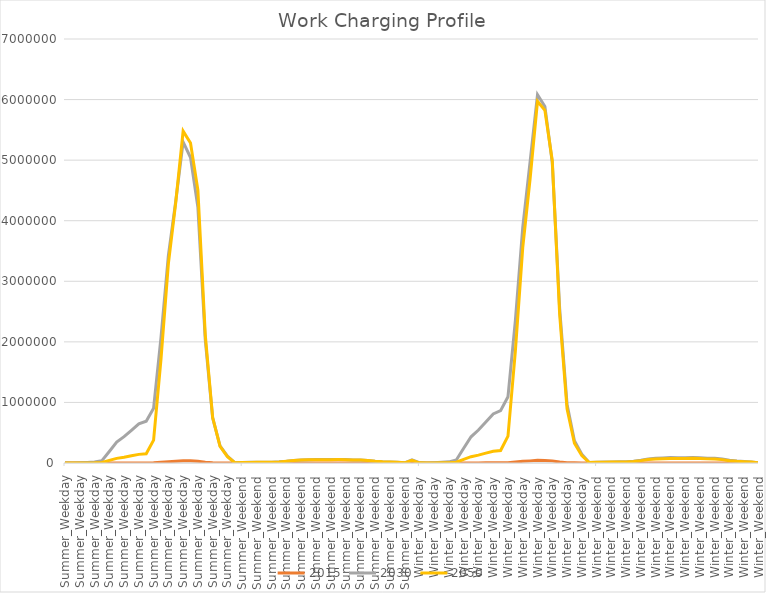
| Category | 2015 | 2030 | 2050 |
|---|---|---|---|
| Summer_Weekday | 2.753 | 3502.4 | 1314.9 |
| Summer_Weekday | 2.74 | 1036.7 | 227.6 |
| Summer_Weekday | 13.685 | 3770.1 | 849.36 |
| Summer_Weekday | 27.383 | 8600.3 | 1915.2 |
| Summer_Weekday | 46.558 | 15150 | 3364.1 |
| Summer_Weekday | 134.15 | 39491 | 8843.3 |
| Summer_Weekday | 695.21 | 190880 | 43017 |
| Summer_Weekday | 1018.9 | 343960 | 76152 |
| Summer_Weekday | 1213.7 | 434170 | 95704 |
| Summer_Weekday | 1536.9 | 539900 | 119170 |
| Summer_Weekday | 1797.3 | 646510 | 142450 |
| Summer_Weekday | 1838.7 | 690330 | 151640 |
| Summer_Weekday | 3406.4 | 903900 | 377610 |
| Summer_Weekday | 12405 | 2071000 | 1712300 |
| Summer_Weekday | 22699 | 3423000 | 3286500 |
| Summer_Weekday | 29339 | 4323800 | 4300500 |
| Summer_Weekday | 36922 | 5300700 | 5479300 |
| Summer_Weekday | 35182 | 5043600 | 5281700 |
| Summer_Weekday | 29696 | 4219800 | 4505600 |
| Summer_Weekday | 13578 | 2031300 | 2115900 |
| Summer_Weekday | 4726.6 | 742860 | 749410 |
| Summer_Weekday | 1767.2 | 283710 | 274840 |
| Summer_Weekday | 666.05 | 112890 | 104370 |
| Summer_Weekend | 40.694 | 5844.7 | 5351.5 |
| Summer_Weekend | 40.758 | 8211.4 | 7955.7 |
| Summer_Weekend | 57.619 | 10633 | 10173 |
| Summer_Weekend | 57.646 | 11614 | 11252 |
| Summer_Weekend | 66.076 | 12825 | 12361 |
| Summer_Weekend | 57.659 | 12104 | 11792 |
| Summer_Weekend | 108.23 | 18879 | 17904 |
| Summer_Weekend | 162.46 | 29598 | 28262 |
| Summer_Weekend | 234.2 | 43040 | 41151 |
| Summer_Weekend | 257.5 | 50537 | 48786 |
| Summer_Weekend | 268.08 | 53399 | 51656 |
| Summer_Weekend | 287.06 | 56736 | 54825 |
| Summer_Weekend | 274.45 | 56023 | 54376 |
| Summer_Weekend | 282.86 | 56498 | 54675 |
| Summer_Weekend | 289.19 | 57897 | 56046 |
| Summer_Weekend | 276.56 | 56448 | 54788 |
| Summer_Weekend | 244.92 | 51172 | 49821 |
| Summer_Weekend | 243.41 | 49124 | 47606 |
| Summer_Weekend | 192.83 | 41774 | 40860 |
| Summer_Weekend | 125.3 | 29145 | 28754 |
| Summer_Weekend | 91.474 | 20379 | 20003 |
| Summer_Weekend | 66.129 | 14786 | 14519 |
| Summer_Weekend | 49.228 | 10893 | 10683 |
| Summer_Weekend | 0.077 | 2856.9 | 3143.7 |
| Winter_Weekday | 263.42 | 50201 | 42311 |
| Winter_Weekday | 4.127 | 6775.3 | 3222.6 |
| Winter_Weekday | 4.062 | 1296.5 | 309.39 |
| Winter_Weekday | 20.283 | 4810.4 | 1180.6 |
| Winter_Weekday | 40.586 | 10875 | 2636 |
| Winter_Weekday | 69.005 | 19115 | 4618.6 |
| Winter_Weekday | 198.82 | 50152 | 12230 |
| Winter_Weekday | 1030.4 | 243610 | 59811 |
| Winter_Weekday | 1510.2 | 432980 | 104290 |
| Winter_Weekday | 1798.9 | 544690 | 130560 |
| Winter_Weekday | 2277.9 | 678030 | 162760 |
| Winter_Weekday | 2663.9 | 810820 | 194260 |
| Winter_Weekday | 2725.4 | 863710 | 206230 |
| Winter_Weekday | 4593.3 | 1094500 | 443200 |
| Winter_Weekday | 15197 | 2351300 | 1845900 |
| Winter_Weekday | 27267 | 3889300 | 3555300 |
| Winter_Weekday | 35106 | 4979600 | 4697400 |
| Winter_Weekday | 43936 | 6081300 | 5972600 |
| Winter_Weekday | 41772 | 5885400 | 5822300 |
| Winter_Weekday | 35144 | 4958700 | 4989700 |
| Winter_Weekday | 16079 | 2554100 | 2452200 |
| Winter_Weekday | 5606.5 | 971070 | 894120 |
| Winter_Weekday | 2110.6 | 367580 | 326770 |
| Winter_Weekday | 796.18 | 144930 | 123790 |
| Winter_Weekend | 58.509 | 9453.4 | 7555.1 |
| Winter_Weekend | 58.573 | 12847 | 10903 |
| Winter_Weekend | 82.816 | 16764 | 14033 |
| Winter_Weekend | 82.842 | 18170 | 15420 |
| Winter_Weekend | 94.964 | 20129 | 16986 |
| Winter_Weekend | 82.855 | 18873 | 16114 |
| Winter_Weekend | 155.57 | 29921 | 24812 |
| Winter_Weekend | 233.51 | 46719 | 39026 |
| Winter_Weekend | 336.62 | 67882 | 56785 |
| Winter_Weekend | 370.07 | 79244 | 66985 |
| Winter_Weekend | 385.26 | 83625 | 70849 |
| Winter_Weekend | 412.55 | 88911 | 75237 |
| Winter_Weekend | 394.4 | 87555 | 74450 |
| Winter_Weekend | 406.5 | 88459 | 74975 |
| Winter_Weekend | 415.6 | 90631 | 76842 |
| Winter_Weekend | 397.43 | 88220 | 75015 |
| Winter_Weekend | 351.95 | 79822 | 68105 |
| Winter_Weekend | 349.81 | 76846 | 65233 |
| Winter_Weekend | 277.08 | 64974 | 55722 |
| Winter_Weekend | 180.03 | 45087 | 39039 |
| Winter_Weekend | 131.43 | 31629 | 27230 |
| Winter_Weekend | 95.017 | 22941 | 19760 |
| Winter_Weekend | 70.734 | 16915 | 14549 |
| Winter_Weekend | 0.077 | 4096.8 | 4041.3 |